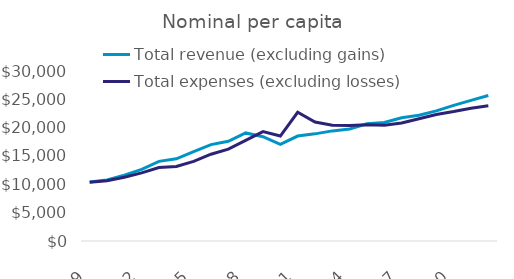
| Category |  Total revenue (excluding gains)  |  Total expenses (excluding losses)  |
|---|---|---|
| 1999-06-01 | 10420.999 | 10387.623 |
| 2000-06-01 | 10786.615 | 10632.747 |
| 2001-06-01 | 11622.355 | 11256.029 |
| 2002-06-01 | 12649.781 | 12023.919 |
| 2003-06-01 | 14057.041 | 12972.937 |
| 2004-06-01 | 14500.522 | 13137.068 |
| 2005-06-01 | 15755.34 | 14044.123 |
| 2006-06-01 | 17012.018 | 15317.483 |
| 2007-06-01 | 17602.146 | 16214.789 |
| 2008-06-01 | 19070.368 | 17747.051 |
| 2009-06-01 | 18411.004 | 19315.807 |
| 2010-06-01 | 17070.015 | 18521.515 |
| 2011-06-01 | 18524.762 | 22720.958 |
| 2012-06-01 | 18907.981 | 21004.179 |
| 2013-06-01 | 19430.224 | 20409.941 |
| 2014-06-01 | 19779.408 | 20365.48 |
| 2015-06-01 | 20674.101 | 20512.865 |
| 2016-06-01 | 20916.045 | 20430.428 |
| 2017-06-01 | 21741.588 | 20820.626 |
| 2018-06-01 | 22180.011 | 21573.353 |
| 2019-06-01 | 22966.317 | 22309.929 |
| 2020-06-01 | 23922.534 | 22837.361 |
| 2021-06-01 | 24813.867 | 23440.09 |
| 2022-06-01 | 25678.952 | 23870.838 |